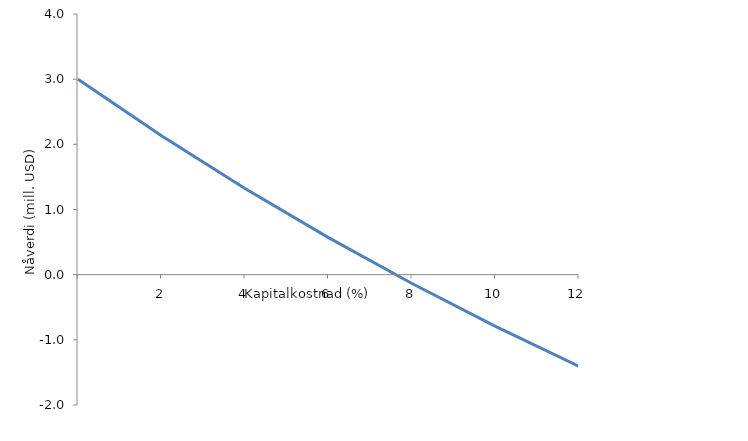
| Category | A-B | Stor fabrikk |
|---|---|---|
| nan | 3 |  |
| 2.0 | 2.131 |  |
| 4.0 | 1.322 |  |
| 6.0 | 0.568 |  |
| 8.0 | -0.136 |  |
| 10.0 | -0.793 |  |
| 12.000000000000002 | -1.408 |  |